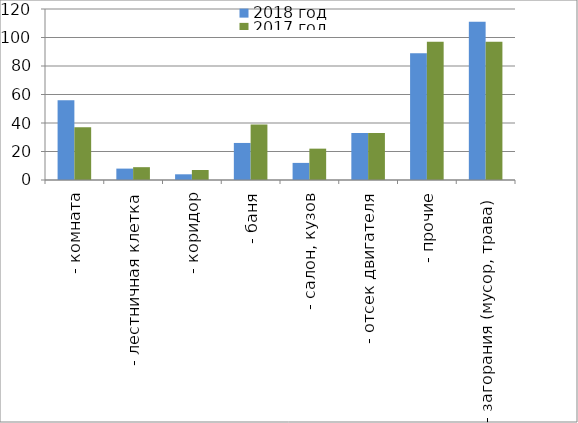
| Category | 2018 год | 2017 год |
|---|---|---|
|  - комната | 56 | 37 |
|  - лестничная клетка | 8 | 9 |
|  - коридор | 4 | 7 |
|  - баня | 26 | 39 |
|  - салон, кузов | 12 | 22 |
|  - отсек двигателя | 33 | 33 |
| - прочие | 89 | 97 |
| - загорания (мусор, трава)  | 111 | 97 |